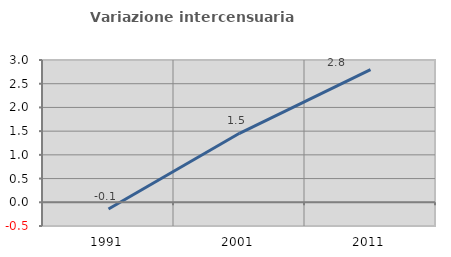
| Category | Variazione intercensuaria annua |
|---|---|
| 1991.0 | -0.141 |
| 2001.0 | 1.455 |
| 2011.0 | 2.799 |